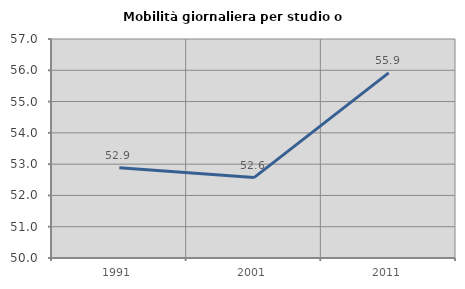
| Category | Mobilità giornaliera per studio o lavoro |
|---|---|
| 1991.0 | 52.882 |
| 2001.0 | 52.57 |
| 2011.0 | 55.919 |